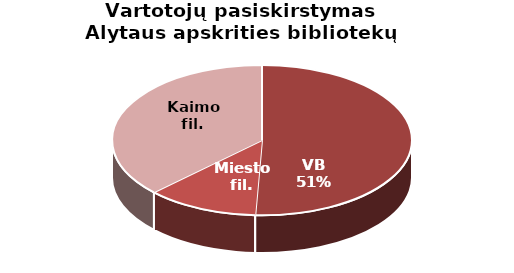
| Category | Vartotojų pasiskirstymas Alytaus apskrities bibliotekų padaliniuose |
|---|---|
| VB | 12478 |
| Miesto fil. | 2973 |
| Kaimo fil. | 9153 |